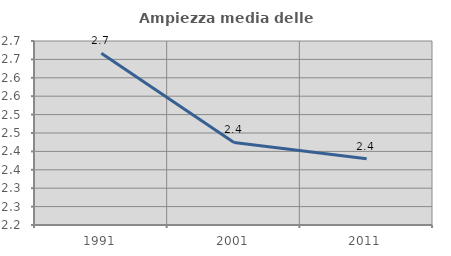
| Category | Ampiezza media delle famiglie |
|---|---|
| 1991.0 | 2.667 |
| 2001.0 | 2.424 |
| 2011.0 | 2.38 |